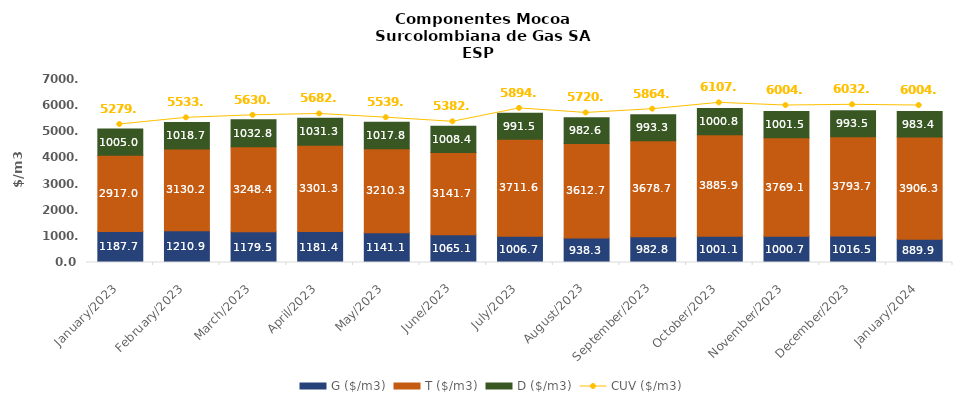
| Category | G ($/m3) | T ($/m3) | D ($/m3) |
|---|---|---|---|
| 2023-01-01 | 1187.7 | 2917.03 | 1005.02 |
| 2023-02-01 | 1210.89 | 3130.19 | 1018.71 |
| 2023-03-01 | 1179.48 | 3248.44 | 1032.83 |
| 2023-04-01 | 1181.36 | 3301.34 | 1031.34 |
| 2023-05-01 | 1141.05 | 3210.28 | 1017.81 |
| 2023-06-01 | 1065.07 | 3141.65 | 1008.39 |
| 2023-07-01 | 1006.71 | 3711.61 | 991.5 |
| 2023-08-01 | 938.29 | 3612.73 | 982.58 |
| 2023-09-01 | 982.76 | 3678.68 | 993.3 |
| 2023-10-01 | 1001.11 | 3885.88 | 1000.84 |
| 2023-11-01 | 1000.74 | 3769.12 | 1001.53 |
| 2023-12-01 | 1016.49 | 3793.69 | 993.53 |
| 2024-01-01 | 889.86 | 3906.34 | 983.35 |